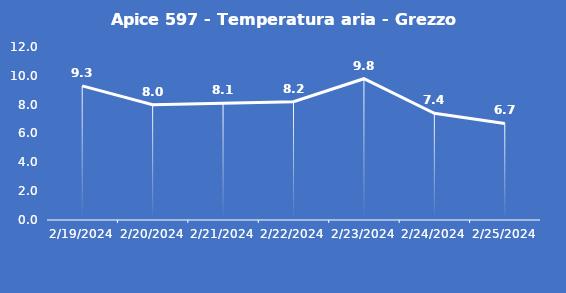
| Category | Apice 597 - Temperatura aria - Grezzo (°C) |
|---|---|
| 2/19/24 | 9.3 |
| 2/20/24 | 8 |
| 2/21/24 | 8.1 |
| 2/22/24 | 8.2 |
| 2/23/24 | 9.8 |
| 2/24/24 | 7.4 |
| 2/25/24 | 6.7 |